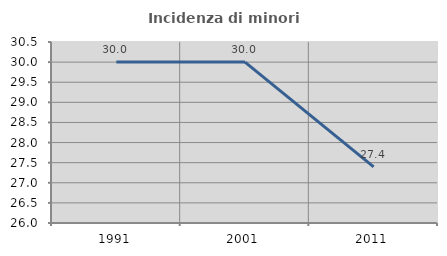
| Category | Incidenza di minori stranieri |
|---|---|
| 1991.0 | 30 |
| 2001.0 | 30 |
| 2011.0 | 27.397 |